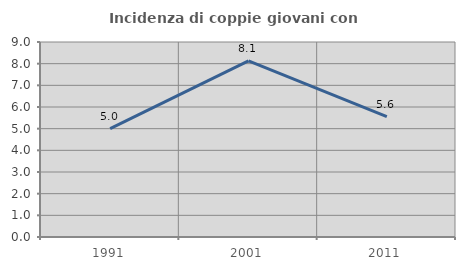
| Category | Incidenza di coppie giovani con figli |
|---|---|
| 1991.0 | 5 |
| 2001.0 | 8.13 |
| 2011.0 | 5.556 |